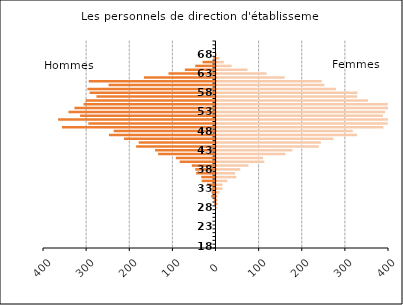
| Category | Series 2 |
|---|---|
| 18.0 | 0 |
| 19.0 | 0 |
| 20.0 | 0 |
| 21.0 | 0 |
| 22.0 | 0 |
| 23.0 | 0 |
| 24.0 | 0 |
| 25.0 | 0 |
| 26.0 | 0 |
| 27.0 | 0 |
| 28.0 | 2 |
| 29.0 | 3 |
| 30.0 | 2 |
| 31.0 | 2 |
| 32.0 | 7 |
| 33.0 | 14 |
| 34.0 | 14 |
| 35.0 | 25 |
| 36.0 | 46 |
| 37.0 | 43 |
| 38.0 | 55 |
| 39.0 | 74 |
| 40.0 | 111 |
| 41.0 | 108 |
| 42.0 | 160 |
| 43.0 | 176 |
| 44.0 | 237 |
| 45.0 | 242 |
| 46.0 | 271 |
| 47.0 | 326 |
| 48.0 | 316 |
| 49.0 | 387 |
| 50.0 | 397 |
| 51.0 | 443 |
| 52.0 | 386 |
| 53.0 | 391 |
| 54.0 | 411 |
| 55.0 | 397 |
| 56.0 | 351 |
| 57.0 | 326 |
| 58.0 | 327 |
| 59.0 | 277 |
| 60.0 | 250 |
| 61.0 | 244 |
| 62.0 | 158 |
| 63.0 | 116 |
| 64.0 | 72 |
| 65.0 | 35 |
| 66.0 | 17 |
| 67.0 | 7 |
| 68.0 | 0 |
| 69.0 | 0 |
| 70.0 | 0 |
| 75.0 | 0 |